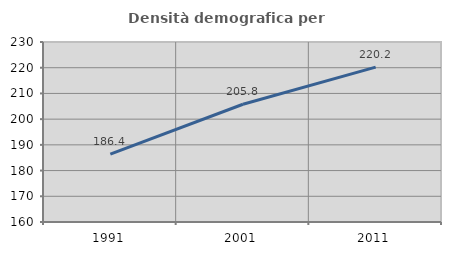
| Category | Densità demografica |
|---|---|
| 1991.0 | 186.381 |
| 2001.0 | 205.78 |
| 2011.0 | 220.242 |